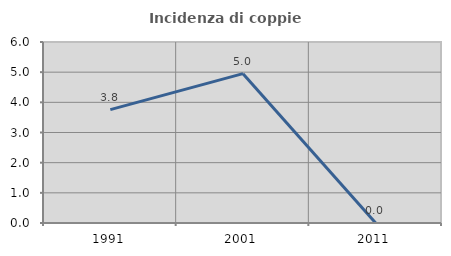
| Category | Incidenza di coppie miste |
|---|---|
| 1991.0 | 3.759 |
| 2001.0 | 4.95 |
| 2011.0 | 0 |